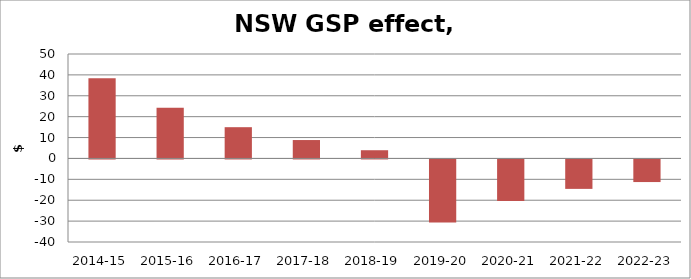
| Category | Series 0 |
|---|---|
| 2014-15 | 38.36 |
| 2015-16 | 24.262 |
| 2016-17 | 14.964 |
| 2017-18 | 8.811 |
| 2018-19 | 3.934 |
| 2019-20 | -30.23 |
| 2020-21 | -19.918 |
| 2021-22 | -14.094 |
| 2022-23 | -10.825 |